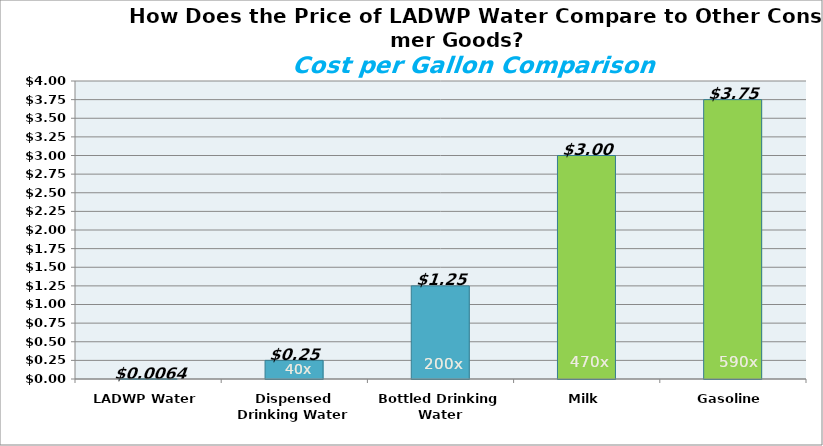
| Category | Cost per Gallon |
|---|---|
| LADWP Water | 0.006 |
| Dispensed Drinking Water | 0.25 |
| Bottled Drinking Water | 1.25 |
| Milk | 3 |
| Gasoline | 3.75 |